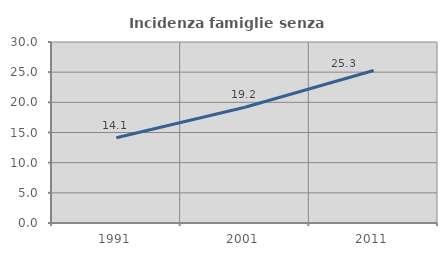
| Category | Incidenza famiglie senza nuclei |
|---|---|
| 1991.0 | 14.127 |
| 2001.0 | 19.186 |
| 2011.0 | 25.267 |